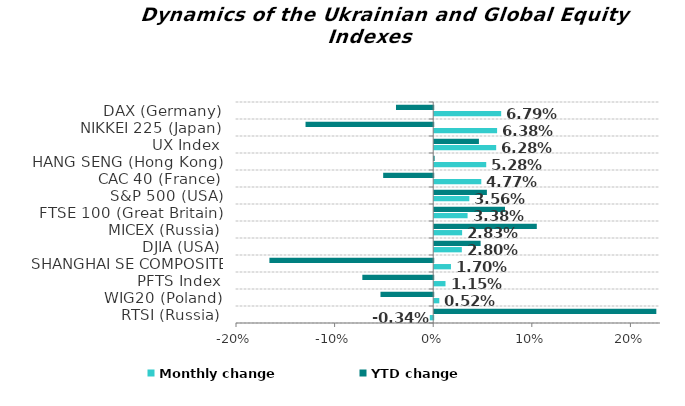
| Category | Monthly change | YTD change |
|---|---|---|
| RTSI (Russia) | -0.003 | 0.225 |
| WIG20 (Poland) | 0.005 | -0.053 |
| PFTS Index | 0.011 | -0.072 |
| SHANGHAI SE COMPOSITE (China) | 0.017 | -0.166 |
| DJIA (USA) | 0.028 | 0.047 |
| MICEX (Russia) | 0.028 | 0.104 |
| FTSE 100 (Great Britain) | 0.034 | 0.072 |
| S&P 500 (USA) | 0.036 | 0.053 |
| CAC 40 (France) | 0.048 | -0.051 |
| HANG SENG (Hong Kong) | 0.053 | 0 |
| UX Index | 0.063 | 0.045 |
| NIKKEI 225 (Japan) | 0.064 | -0.129 |
| DAX (Germany) | 0.068 | -0.038 |